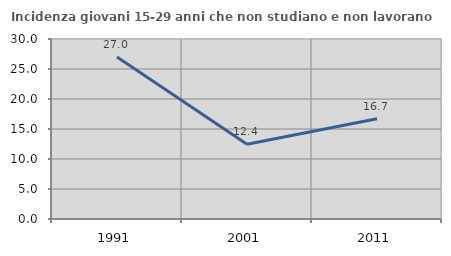
| Category | Incidenza giovani 15-29 anni che non studiano e non lavorano  |
|---|---|
| 1991.0 | 26.998 |
| 2001.0 | 12.447 |
| 2011.0 | 16.722 |